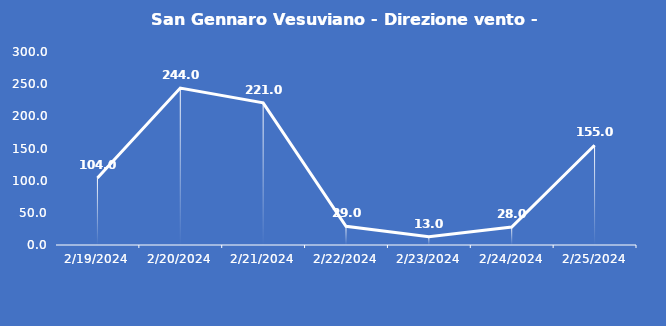
| Category | San Gennaro Vesuviano - Direzione vento - Grezzo (°N) |
|---|---|
| 2/19/24 | 104 |
| 2/20/24 | 244 |
| 2/21/24 | 221 |
| 2/22/24 | 29 |
| 2/23/24 | 13 |
| 2/24/24 | 28 |
| 2/25/24 | 155 |